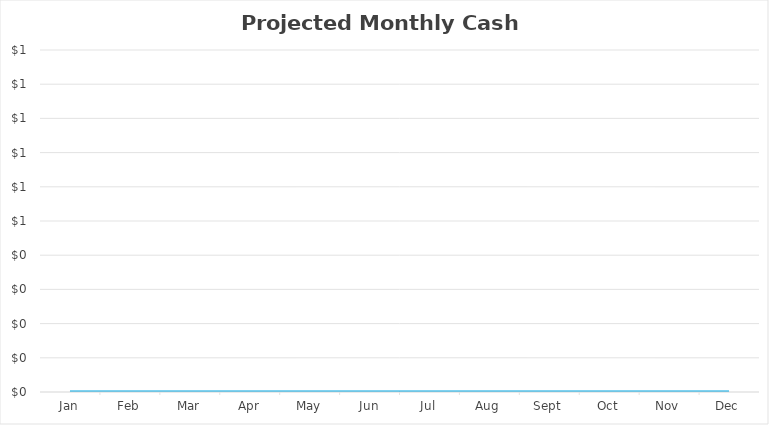
| Category | Series 0 |
|---|---|
| 2017-01-01 | 0 |
| 2017-02-01 | 0 |
| 2017-03-01 | 0 |
| 2017-04-01 | 0 |
| 2017-05-01 | 0 |
| 2017-06-01 | 0 |
| 2017-07-01 | 0 |
| 2017-08-01 | 0 |
| 2017-09-01 | 0 |
| 2017-10-01 | 0 |
| 2017-11-01 | 0 |
| 2017-12-01 | 0 |